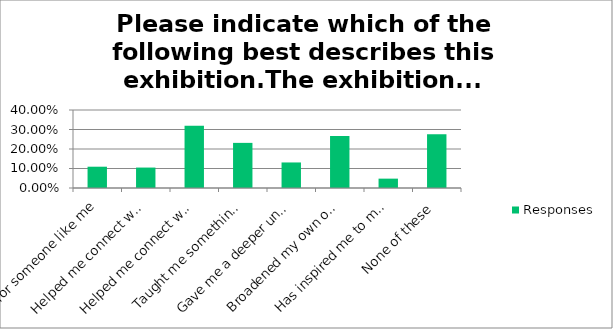
| Category | Responses |
|---|---|
| Is for someone like me | 0.109 |
| Helped me connect with my cultural identity | 0.105 |
| Helped me connect with others' cultural identity | 0.319 |
| Taught me something new | 0.231 |
| Gave me a deeper understanding of a topic I already knew something about | 0.131 |
| Broadened my own or others' horizons | 0.266 |
| Has inspired me to make a change in my life | 0.048 |
| None of these | 0.275 |